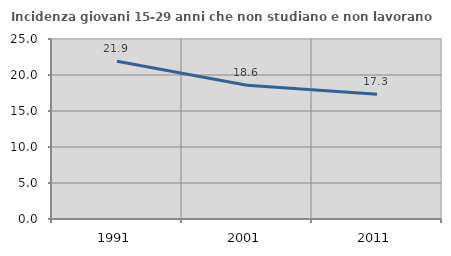
| Category | Incidenza giovani 15-29 anni che non studiano e non lavorano  |
|---|---|
| 1991.0 | 21.909 |
| 2001.0 | 18.579 |
| 2011.0 | 17.327 |